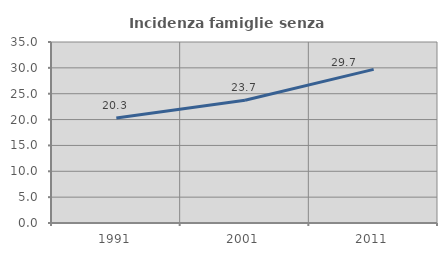
| Category | Incidenza famiglie senza nuclei |
|---|---|
| 1991.0 | 20.311 |
| 2001.0 | 23.745 |
| 2011.0 | 29.712 |